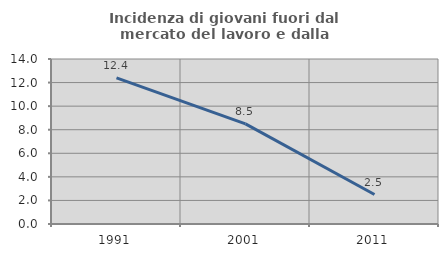
| Category | Incidenza di giovani fuori dal mercato del lavoro e dalla formazione  |
|---|---|
| 1991.0 | 12.393 |
| 2001.0 | 8.491 |
| 2011.0 | 2.5 |